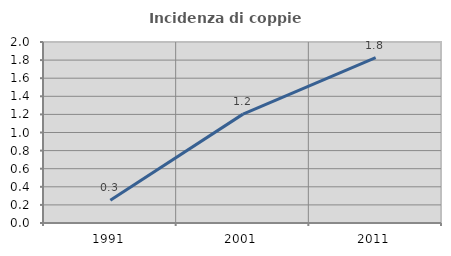
| Category | Incidenza di coppie miste |
|---|---|
| 1991.0 | 0.251 |
| 2001.0 | 1.203 |
| 2011.0 | 1.827 |